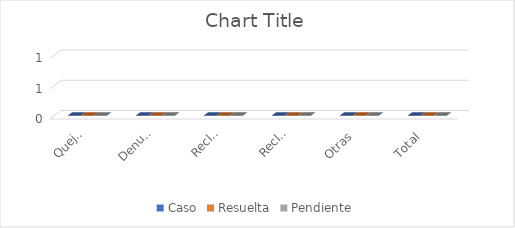
| Category | Caso | Resuelta | Pendiente |
|---|---|---|---|
| Quejas | 0 | 0 | 0 |
| Denuncias | 0 | 0 | 0 |
| Reclamaciones | 0 | 0 | 0 |
| Reclamaciones | 0 | 0 | 0 |
| Otras | 0 | 0 | 0 |
| Total | 0 | 0 | 0 |